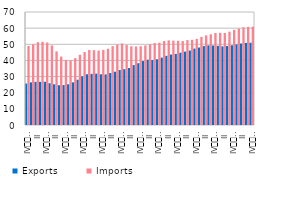
| Category | Exports | Imports |
|---|---|---|
| IV
2007 | 25.685 | 48.988 |
| I | 26.435 | 50.079 |
| II | 26.762 | 51.284 |
| III | 26.745 | 51.516 |
| IV
2008 | 26.815 | 51.116 |
| I | 25.895 | 49.29 |
| II | 25.249 | 45.652 |
| III | 24.656 | 42.354 |
| IV
2009 | 24.756 | 40.32 |
| I | 25.245 | 39.961 |
| II | 26.435 | 41.413 |
| III | 28.059 | 43.49 |
| IV
2010 | 30.174 | 45.17 |
| I | 31.45 | 46.443 |
| II | 31.688 | 46.344 |
| III | 31.841 | 46.086 |
| IV
2011 | 31.438 | 46.506 |
| I | 31.357 | 47.241 |
| II | 32.233 | 48.822 |
| III | 33.016 | 49.83 |
| IV
2012 | 34.052 | 50.45 |
| I | 34.607 | 49.528 |
| II | 35.308 | 48.789 |
| III | 37.081 | 48.635 |
| IV
2013 | 38.263 | 48.82 |
| I | 39.61 | 49.276 |
| II | 40.486 | 50.052 |
| III | 40.292 | 50.758 |
| IV
2014 | 40.743 | 51.021 |
| I | 41.753 | 52.012 |
| II | 42.869 | 52.412 |
| III | 43.67 | 52.242 |
| IV
2015 | 44.034 | 52.197 |
| I | 44.801 | 51.988 |
| II | 45.482 | 52.59 |
| III | 46.131 | 52.766 |
| IV
2016 | 47.342 | 53.366 |
| I | 48.013 | 54.597 |
| II | 48.893 | 55.523 |
| III | 49.328 | 56.197 |
| IV
2017 | 49.247 | 56.977 |
| I | 49.074 | 57.099 |
| II | 48.705 | 56.986 |
| III | 48.928 | 57.846 |
| IV
2018 | 49.389 | 58.934 |
| I | 49.984 | 59.799 |
| II | 50.47 | 60.53 |
| III | 50.867 | 60.782 |
| IV
2019 | 50.962 | 60.91 |